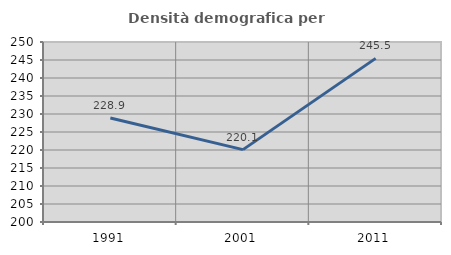
| Category | Densità demografica |
|---|---|
| 1991.0 | 228.883 |
| 2001.0 | 220.106 |
| 2011.0 | 245.453 |